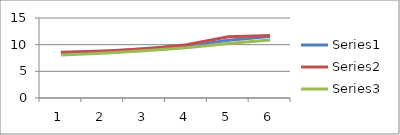
| Category | Series 0 | Series 1 | Series 2 |
|---|---|---|---|
| 0 | 8.373 | 8.569 | 8.045 |
| 1 | 8.621 | 8.813 | 8.396 |
| 2 | 9.271 | 9.206 | 8.855 |
| 3 | 9.68 | 9.987 | 9.419 |
| 4 | 10.825 | 11.5 | 10.217 |
| 5 | 11.507 | 11.717 | 10.888 |